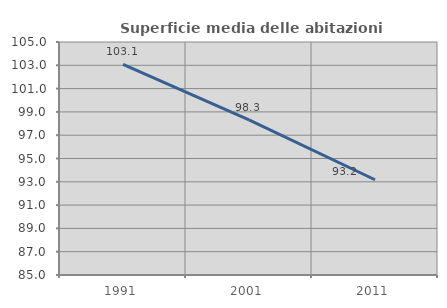
| Category | Superficie media delle abitazioni occupate |
|---|---|
| 1991.0 | 103.084 |
| 2001.0 | 98.312 |
| 2011.0 | 93.175 |